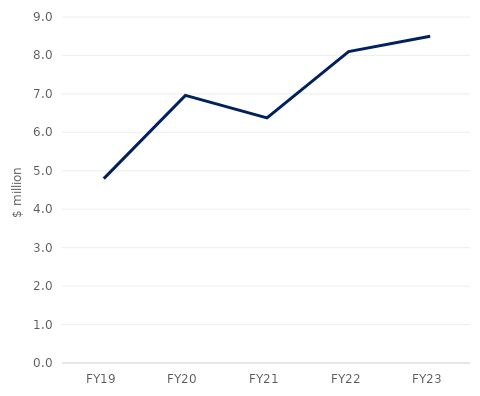
| Category | Net Sales |
|---|---|
| FY19 | 4.795 |
| FY20 | 6.96 |
| FY21 | 6.374 |
| FY22 | 8.1 |
| FY23 | 8.5 |